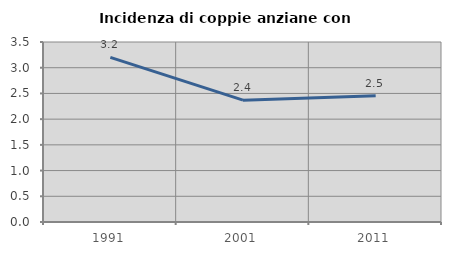
| Category | Incidenza di coppie anziane con figli |
|---|---|
| 1991.0 | 3.2 |
| 2001.0 | 2.37 |
| 2011.0 | 2.454 |